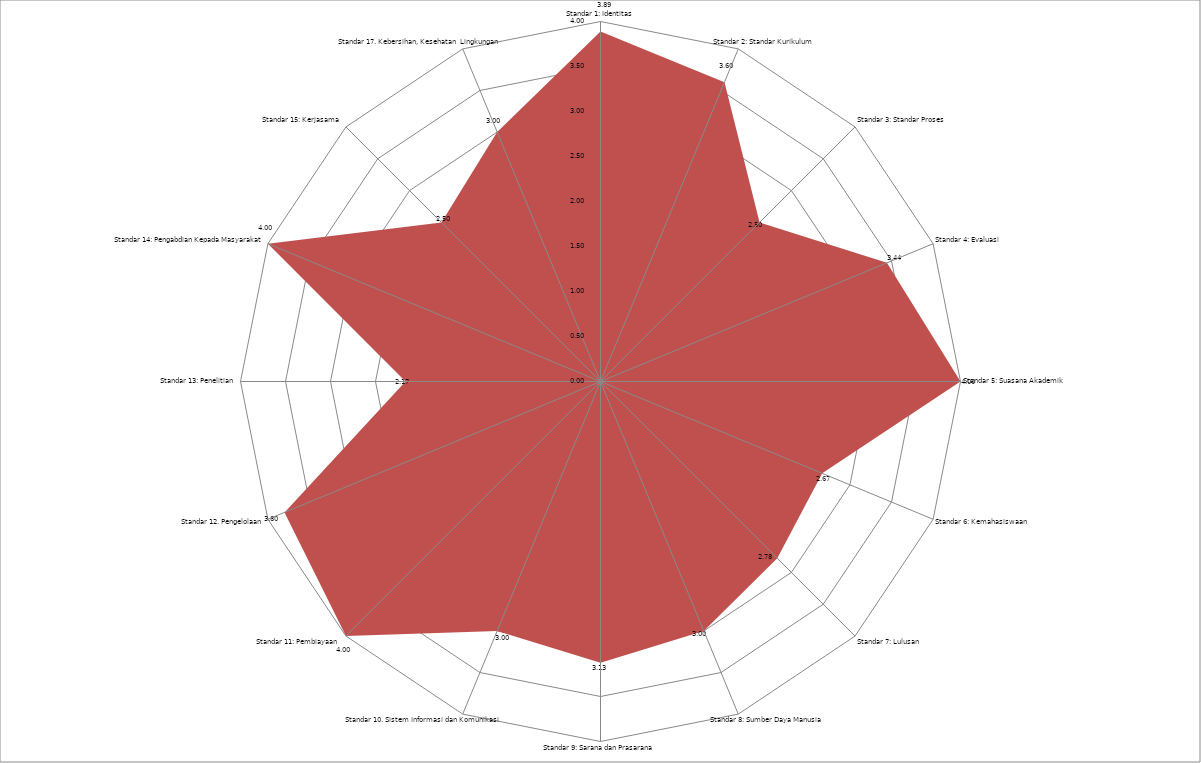
| Category | Nilai per standar |
|---|---|
| Standar 1: Identitas | 3.889 |
| Standar 2: Standar Kurikulum | 3.6 |
| Standar 3: Standar Proses | 2.5 |
| Standar 4: Evaluasi | 3.444 |
| Standar 5: Suasana Akademik | 4 |
| Standar 6: Kemahasiswaan | 2.667 |
| Standar 7: Lulusan  | 2.778 |
| Standar 8: Sumber Daya Manusia | 3 |
| Standar 9: Sarana dan Prasarana  | 3.125 |
| Standar 10. Sistem Informasi dan Komunikasi | 3 |
| Standar 11: Pembiayaan  | 4 |
| Standar 12. Pengelolaan | 3.8 |
| Standar 13: Penelitian | 2.167 |
| Standar 14: Pengabdian Kepada Masyarakat | 4 |
| Standar 15: Kerjasama  | 2.5 |
| Standar 17. Kebersihan, Kesehatan  Lingkungan | 3 |